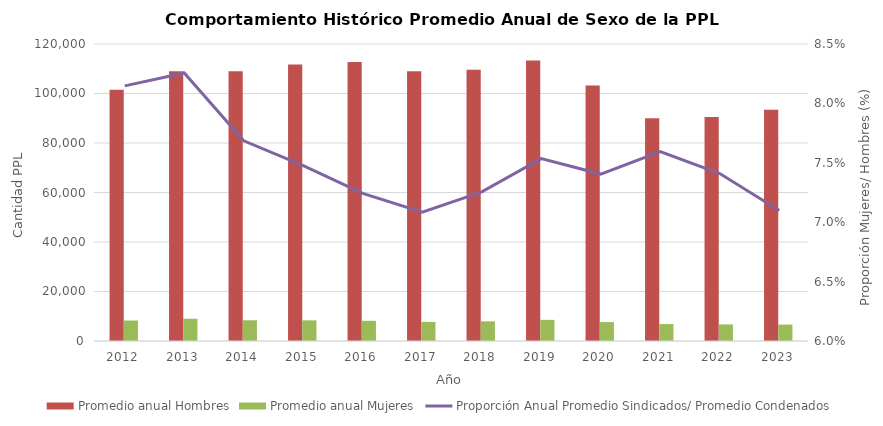
| Category | Promedio anual Hombres | Promedio anual Mujeres |
|---|---|---|
| 2012.0 | 101548.333 | 8273.75 |
| 2013.0 | 108988.333 | 8997.917 |
| 2014.0 | 109009.667 | 8379.417 |
| 2015.0 | 111689.083 | 8351 |
| 2016.0 | 112747 | 8167 |
| 2017.0 | 108939.917 | 7717.75 |
| 2018.0 | 109615.417 | 7954.167 |
| 2019.0 | 113308.833 | 8538.5 |
| 2020.0 | 103182.75 | 7647.583 |
| 2021.0 | 90002.917 | 6834.583 |
| 2022.0 | 90472.5 | 6703.417 |
| 2023.0 | 93399.375 | 6630 |